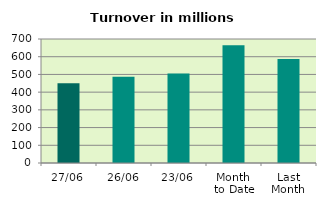
| Category | Series 0 |
|---|---|
| 27/06 | 450.249 |
| 26/06 | 486.451 |
| 23/06 | 505.494 |
| Month 
to Date | 664.045 |
| Last
Month | 587.249 |